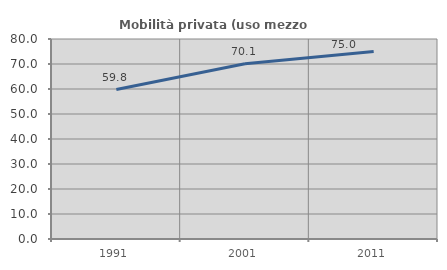
| Category | Mobilità privata (uso mezzo privato) |
|---|---|
| 1991.0 | 59.781 |
| 2001.0 | 70.119 |
| 2011.0 | 74.996 |